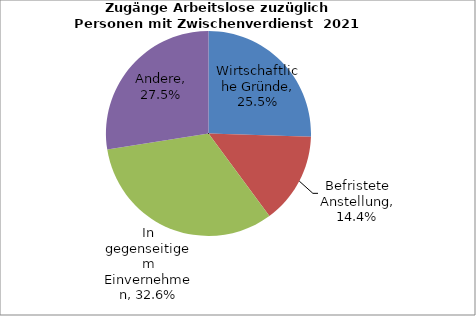
| Category | Series 0 |
|---|---|
| Wirtschaftliche Gründe | 0.255 |
| Befristete Anstellung | 0.144 |
| In gegenseitigem Einvernehmen | 0.326 |
| Andere | 0.275 |